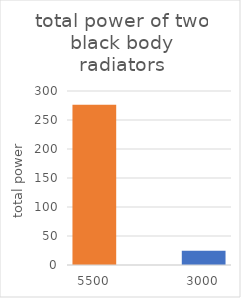
| Category | Series 0 |
|---|---|
| 5500.0 | 276.37 |
| nan | 0 |
| 3000.0 | 24.451 |